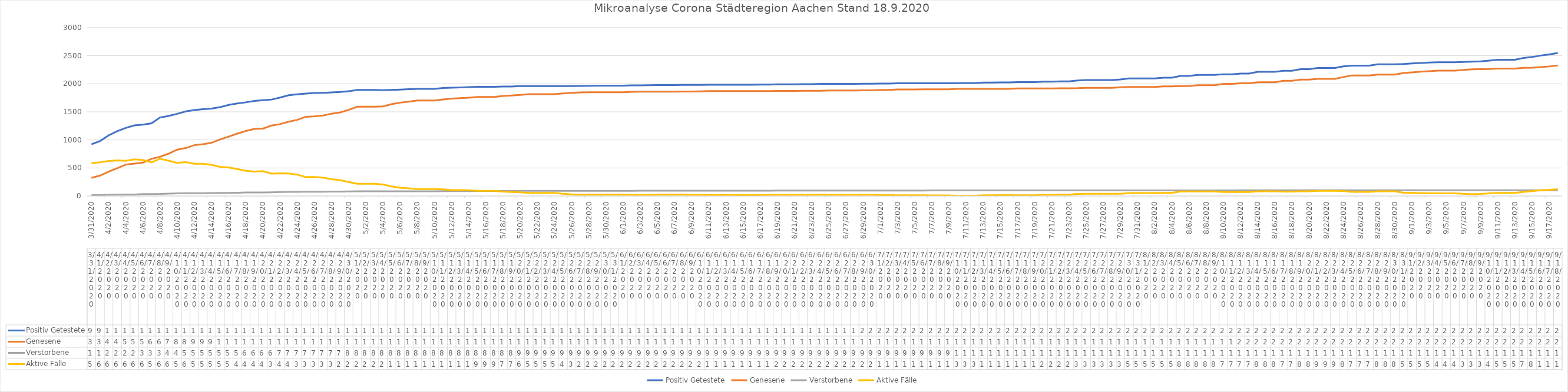
| Category | Positiv Getestete | Genesene | Verstorbene | Aktive Fälle |
|---|---|---|---|---|
| 3/31/20 | 922 | 322 | 15 | 585 |
| 4/1/20 | 980 | 364 | 16 | 600 |
| 4/2/20 | 1081 | 435 | 21 | 625 |
| 4/3/20 | 1155 | 494 | 27 | 634 |
| 4/4/20 | 1213 | 560 | 27 | 626 |
| 4/5/20 | 1259 | 578 | 27 | 654 |
| 4/6/20 | 1272 | 595 | 35 | 642 |
| 4/7/20 | 1295 | 662 | 35 | 598 |
| 4/8/20 | 1399 | 699 | 36 | 664 |
| 4/9/20 | 1426 | 755 | 41 | 630 |
| 4/10/20 | 1465 | 826 | 48 | 591 |
| 4/11/20 | 1508 | 854 | 50 | 604 |
| 4/12/20 | 1532 | 906 | 51 | 575 |
| 4/13/20 | 1547 | 922 | 51 | 574 |
| 4/14/20 | 1557 | 949 | 52 | 556 |
| 4/15/20 | 1583 | 1009 | 54 | 520 |
| 4/16/20 | 1623 | 1058 | 56 | 509 |
| 4/17/20 | 1650 | 1112 | 59 | 479 |
| 4/18/20 | 1669 | 1159 | 62 | 448 |
| 4/19/20 | 1693 | 1195 | 62 | 436 |
| 4/20/20 | 1707 | 1201 | 63 | 443 |
| 4/21/20 | 1719 | 1256 | 65 | 398 |
| 4/22/20 | 1754 | 1281 | 70 | 403 |
| 4/23/20 | 1797 | 1324 | 73 | 400 |
| 4/24/20 | 1812 | 1357 | 74 | 381 |
| 4/25/20 | 1824 | 1412 | 75 | 337 |
| 4/26/20 | 1835 | 1420 | 76 | 339 |
| 4/27/20 | 1839 | 1435 | 76 | 328 |
| 4/28/20 | 1845 | 1467 | 78 | 300 |
| 4/29/20 | 1853 | 1490 | 79 | 284 |
| 4/30/20 | 1866 | 1535 | 82 | 249 |
| 5/1/20 | 1891 | 1591 | 83 | 217 |
| 5/2/20 | 1891 | 1591 | 83 | 217 |
| 5/3/20 | 1891 | 1591 | 83 | 217 |
| 5/4/20 | 1885 | 1598 | 83 | 204 |
| 5/5/20 | 1890 | 1636 | 84 | 170 |
| 5/6/20 | 1895 | 1664 | 84 | 147 |
| 5/7/20 | 1903 | 1682 | 85 | 136 |
| 5/8/20 | 1909 | 1702 | 85 | 122 |
| 5/9/20 | 1909 | 1702 | 85 | 122 |
| 5/10/20 | 1909 | 1702 | 85 | 122 |
| 5/11/20 | 1924 | 1721 | 86 | 117 |
| 5/12/20 | 1929 | 1736 | 87 | 106 |
| 5/13/20 | 1934 | 1743 | 87 | 104 |
| 5/14/20 | 1941 | 1753 | 87 | 101 |
| 5/15/20 | 1945 | 1764 | 88 | 93 |
| 5/16/20 | 1945 | 1764 | 88 | 93 |
| 5/17/20 | 1945 | 1764 | 88 | 93 |
| 5/18/20 | 1951 | 1784 | 88 | 79 |
| 5/19/20 | 1952 | 1791 | 89 | 72 |
| 5/20/20 | 1958 | 1801 | 91 | 66 |
| 5/21/20 | 1960 | 1814 | 91 | 55 |
| 5/22/20 | 1960 | 1814 | 91 | 55 |
| 5/23/20 | 1960 | 1814 | 91 | 55 |
| 5/24/20 | 1960 | 1814 | 91 | 55 |
| 5/25/20 | 1960 | 1829 | 91 | 40 |
| 5/26/20 | 1960 | 1839 | 91 | 30 |
| 5/27/20 | 1962 | 1846 | 92 | 24 |
| 5/28/20 | 1964 | 1849 | 92 | 23 |
| 5/29/20 | 1967 | 1850 | 93 | 24 |
| 5/30/20 | 1967 | 1850 | 93 | 24 |
| 5/31/20 | 1967 | 1850 | 93 | 24 |
| 6/1/20 | 1967 | 1850 | 93 | 24 |
| 6/2/20 | 1971 | 1856 | 93 | 22 |
| 6/3/20 | 1972 | 1858 | 94 | 20 |
| 6/4/20 | 1975 | 1859 | 94 | 22 |
| 6/5/20 | 1976 | 1859 | 94 | 23 |
| 6/6/20 | 1976 | 1859 | 94 | 23 |
| 6/7/20 | 1976 | 1859 | 94 | 23 |
| 6/8/20 | 1979 | 1862 | 94 | 23 |
| 6/9/20 | 1979 | 1863 | 94 | 22 |
| 6/10/20 | 1980 | 1865 | 95 | 20 |
| 6/11/20 | 1982 | 1869 | 95 | 18 |
| 6/12/20 | 1982 | 1869 | 95 | 18 |
| 6/13/20 | 1982 | 1869 | 95 | 18 |
| 6/14/20 | 1982 | 1869 | 95 | 18 |
| 6/15/20 | 1982 | 1871 | 95 | 16 |
| 6/16/20 | 1982 | 1871 | 95 | 16 |
| 6/17/20 | 1985 | 1871 | 95 | 19 |
| 6/18/20 | 1985 | 1871 | 95 | 19 |
| 6/19/20 | 1991 | 1873 | 97 | 21 |
| 6/20/20 | 1991 | 1873 | 97 | 21 |
| 6/21/20 | 1991 | 1873 | 97 | 21 |
| 6/22/20 | 1994 | 1875 | 97 | 22 |
| 6/23/20 | 1994 | 1875 | 97 | 22 |
| 6/24/20 | 1997 | 1876 | 98 | 23 |
| 6/25/20 | 1999 | 1880 | 98 | 21 |
| 6/26/20 | 1999 | 1880 | 98 | 21 |
| 6/27/20 | 1999 | 1880 | 98 | 21 |
| 6/28/20 | 1999 | 1880 | 98 | 21 |
| 6/29/20 | 2001 | 1883 | 98 | 20 |
| 6/30/20 | 2001 | 1883 | 98 | 20 |
| 7/1/20 | 2004 | 1890 | 98 | 16 |
| 7/2/20 | 2004 | 1890 | 98 | 16 |
| 7/3/20 | 2009 | 1898 | 98 | 13 |
| 7/4/20 | 2009 | 1898 | 98 | 13 |
| 7/5/20 | 2009 | 1898 | 98 | 13 |
| 7/6/20 | 2010 | 1900 | 98 | 12 |
| 7/7/20 | 2010 | 1900 | 99 | 11 |
| 7/8/20 | 2010 | 1900 | 99 | 11 |
| 7/9/20 | 2010 | 1900 | 99 | 11 |
| 7/10/20 | 2011 | 1908 | 100 | 3 |
| 7/11/20 | 2011 | 1908 | 100 | 3 |
| 7/12/20 | 2011 | 1908 | 100 | 3 |
| 7/13/20 | 2021 | 1908 | 100 | 13 |
| 7/14/20 | 2021 | 1908 | 100 | 13 |
| 7/15/20 | 2025 | 1909 | 100 | 16 |
| 7/16/20 | 2025 | 1909 | 100 | 16 |
| 7/17/20 | 2030 | 1917 | 100 | 13 |
| 7/18/20 | 2030 | 1917 | 100 | 13 |
| 7/19/20 | 2030 | 1917 | 100 | 13 |
| 7/20/20 | 2037 | 1917 | 100 | 20 |
| 7/21/20 | 2037 | 1917 | 100 | 20 |
| 7/22/20 | 2044 | 1920 | 100 | 24 |
| 7/23/20 | 2044 | 1920 | 100 | 24 |
| 7/24/20 | 2058 | 1922 | 100 | 36 |
| 7/25/20 | 2067 | 1928 | 100 | 39 |
| 7/26/20 | 2067 | 1928 | 100 | 39 |
| 7/27/20 | 2067 | 1928 | 100 | 39 |
| 7/28/20 | 2067 | 1928 | 100 | 39 |
| 7/29/20 | 2076 | 1937 | 100 | 39 |
| 7/30/20 | 2095 | 1942 | 100 | 53 |
| 7/31/20 | 2095 | 1942 | 100 | 53 |
| 8/1/20 | 2095 | 1942 | 100 | 53 |
| 8/2/20 | 2095 | 1942 | 100 | 53 |
| 8/3/20 | 2108 | 1954 | 100 | 54 |
| 8/4/20 | 2108 | 1954 | 100 | 54 |
| 8/5/20 | 2139 | 1958 | 100 | 81 |
| 8/6/20 | 2139 | 1958 | 100 | 81 |
| 8/7/20 | 2157 | 1975 | 100 | 82 |
| 8/8/20 | 2157 | 1975 | 100 | 82 |
| 8/9/20 | 2157 | 1975 | 100 | 82 |
| 8/10/20 | 2170 | 1999 | 100 | 71 |
| 8/11/20 | 2170 | 1999 | 100 | 71 |
| 8/12/20 | 2181 | 2008 | 101 | 72 |
| 8/13/20 | 2181 | 2008 | 101 | 72 |
| 8/14/20 | 2212 | 2028 | 101 | 83 |
| 8/15/20 | 2212 | 2028 | 101 | 83 |
| 8/16/20 | 2212 | 2028 | 101 | 83 |
| 8/17/20 | 2232 | 2053 | 101 | 78 |
| 8/18/20 | 2232 | 2053 | 101 | 78 |
| 8/19/20 | 2261 | 2074 | 102 | 85 |
| 8/20/20 | 2261 | 2074 | 102 | 85 |
| 8/21/20 | 2281 | 2087 | 102 | 92 |
| 8/22/20 | 2281 | 2087 | 102 | 92 |
| 8/23/20 | 2281 | 2087 | 102 | 92 |
| 8/24/20 | 2311 | 2120 | 102 | 89 |
| 8/25/20 | 2324 | 2149 | 102 | 73 |
| 8/26/20 | 2324 | 2149 | 102 | 73 |
| 8/27/20 | 2324 | 2149 | 102 | 73 |
| 8/28/20 | 2348 | 2163 | 102 | 83 |
| 8/29/20 | 2348 | 2163 | 102 | 83 |
| 8/30/20 | 2348 | 2163 | 102 | 83 |
| 8/31/20 | 2353 | 2193 | 102 | 58 |
| 9/1/20 | 2363 | 2203 | 103 | 57 |
| 9/2/20 | 2370 | 2216 | 103 | 51 |
| 9/3/20 | 2378 | 2224 | 103 | 51 |
| 9/4/20 | 2384 | 2235 | 103 | 46 |
| 9/5/20 | 2384 | 2235 | 103 | 46 |
| 9/6/20 | 2384 | 2235 | 103 | 46 |
| 9/7/20 | 2389 | 2247 | 103 | 39 |
| 9/8/20 | 2393 | 2258 | 103 | 32 |
| 9/9/20 | 2400 | 2260 | 103 | 37 |
| 9/10/20 | 2412 | 2263 | 103 | 46 |
| 9/11/20 | 2429 | 2271 | 103 | 55 |
| 9/12/20 | 2429 | 2271 | 103 | 55 |
| 9/13/20 | 2429 | 2271 | 103 | 55 |
| 9/14/20 | 2459 | 2283 | 103 | 73 |
| 9/15/20 | 2477 | 2288 | 103 | 86 |
| 9/16/20 | 2503 | 2297 | 103 | 103 |
| 9/17/20 | 2522 | 2309 | 103 | 110 |
| 9/18/20 | 2550 | 2326 | 103 | 121 |